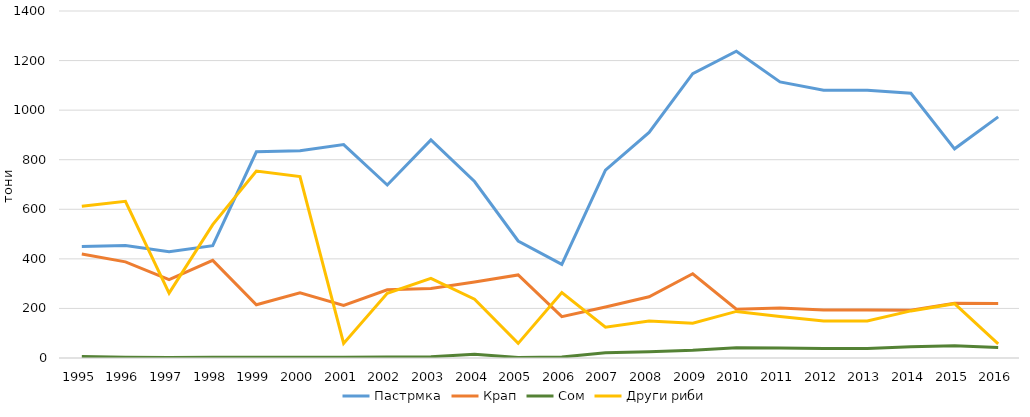
| Category | Пастрмка | Крап | Сом | Други риби |
|---|---|---|---|---|
| 1995.0 | 450 | 420 | 6 | 612 |
| 1996.0 | 454 | 388 | 3 | 632 |
| 1997.0 | 429 | 316 | 2 | 262 |
| 1998.0 | 453 | 394 | 3 | 538 |
| 1999.0 | 832 | 215 | 3 | 754 |
| 2000.0 | 836 | 263 | 3 | 732 |
| 2001.0 | 861 | 212 | 3 | 59 |
| 2002.0 | 698 | 275 | 4 | 261 |
| 2003.0 | 880 | 280 | 5 | 321 |
| 2004.0 | 712 | 307 | 15 | 237 |
| 2005.0 | 472 | 335 | 2 | 59 |
| 2006.0 | 378 | 167 | 4 | 264 |
| 2007.0 | 758 | 206 | 21 | 124 |
| 2008.0 | 910 | 247 | 25 | 149 |
| 2009.0 | 1147 | 340 | 31 | 140 |
| 2010.0 | 1238 | 197 | 41 | 188 |
| 2011.0 | 1114 | 202 | 40 | 167 |
| 2012.0 | 1080 | 194 | 38 | 149 |
| 2013.0 | 1080 | 194 | 38 | 149 |
| 2014.0 | 1068 | 193 | 45 | 190 |
| 2015.0 | 844 | 221 | 49 | 219 |
| 2016.0 | 973 | 220 | 42 | 57 |